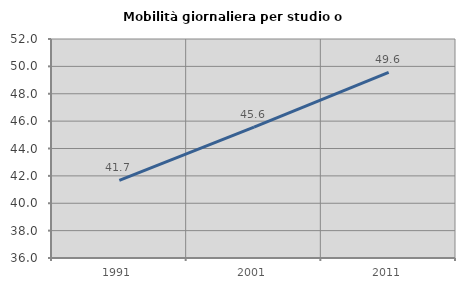
| Category | Mobilità giornaliera per studio o lavoro |
|---|---|
| 1991.0 | 41.677 |
| 2001.0 | 45.559 |
| 2011.0 | 49.56 |